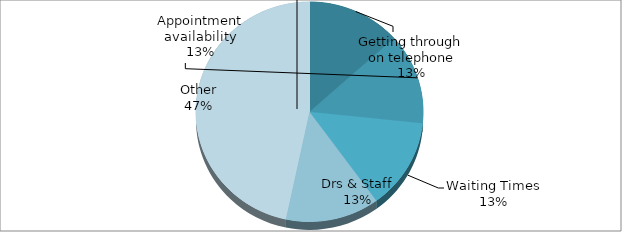
| Category | Series 0 |
|---|---|
| Getting through on telephone | 2 |
| Appointment availability | 2 |
| Waiting Times | 2 |
| Drs & Staff | 2 |
| Other | 7 |